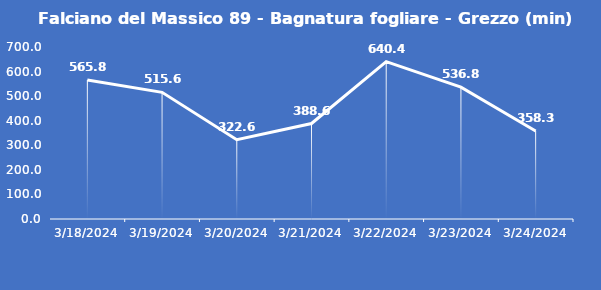
| Category | Falciano del Massico 89 - Bagnatura fogliare - Grezzo (min) |
|---|---|
| 3/18/24 | 565.8 |
| 3/19/24 | 515.6 |
| 3/20/24 | 322.6 |
| 3/21/24 | 388.6 |
| 3/22/24 | 640.4 |
| 3/23/24 | 536.8 |
| 3/24/24 | 358.3 |